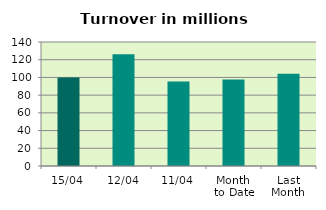
| Category | Series 0 |
|---|---|
| 15/04 | 99.9 |
| 12/04 | 126.184 |
| 11/04 | 95.37 |
| Month 
to Date | 97.66 |
| Last
Month | 104.085 |